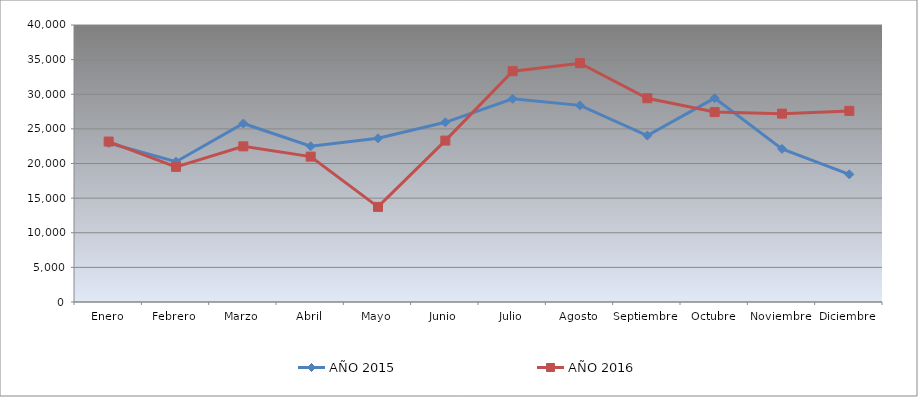
| Category | AÑO 2015 | AÑO 2016 |
|---|---|---|
| Enero | 22964.389 | 23171.127 |
| Febrero | 20259.152 | 19519.696 |
| Marzo | 25777.456 | 22475.86 |
| Abril | 22486.559 | 20993.17 |
| Mayo | 23642.02 | 13736.386 |
| Junio | 25948.713 | 23311.409 |
| Julio | 29344.267 | 33333.902 |
| Agosto | 28392.836 | 34485.854 |
| Septiembre | 24032.107 | 29426.482 |
| Octubre | 29442.582 | 27426.693 |
| Noviembre | 22112.329 | 27201.423 |
| Diciembre | 18434.517 | 27598.718 |